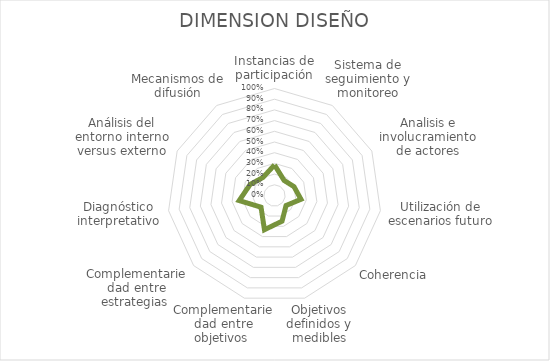
| Category | Series 0 |
|---|---|
| Instancias de participación | 0.286 |
| Sistema de seguimiento y monitoreo | 0.167 |
| Analisis e involucramiento de actores | 0.2 |
| Utilización de escenarios futuro | 0.25 |
| Coherencia | 0.143 |
| Objetivos definidos y medibles | 0.25 |
| Complementariedad entre objetivos  | 0.333 |
| Complementariedad entre estrategias  | 0.167 |
| Diagnóstico interpretativo | 0.333 |
| Análisis del entorno interno versus externo | 0.25 |
| Mecanismos de difusión | 0.2 |